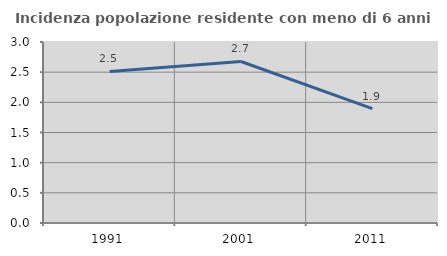
| Category | Incidenza popolazione residente con meno di 6 anni |
|---|---|
| 1991.0 | 2.511 |
| 2001.0 | 2.677 |
| 2011.0 | 1.897 |